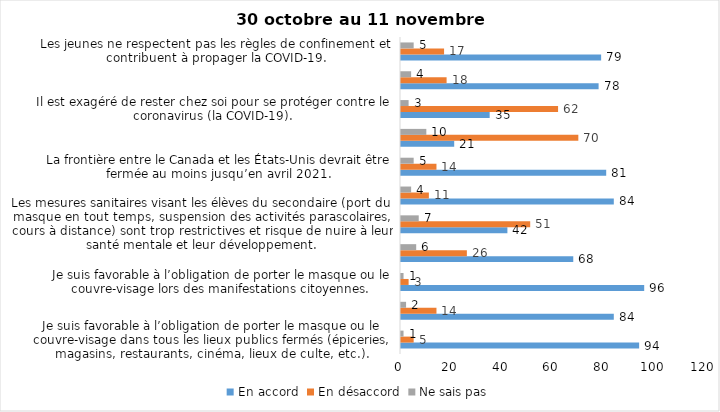
| Category | En accord | En désaccord | Ne sais pas |
|---|---|---|---|
| Je suis favorable à l’obligation de porter le masque ou le couvre-visage dans tous les lieux publics fermés (épiceries, magasins, restaurants, cinéma, lieux de culte, etc.). | 94 | 5 | 1 |
| C’est une bonne chose que les policiers puissent donner facilement des contraventions aux gens qui ne respectent pas les mesures pour prévenir le coronavirus (la COVID-19). | 84 | 14 | 2 |
| Je suis favorable à l’obligation de porter le masque ou le couvre-visage lors des manifestations citoyennes. | 96 | 3 | 1 |
| C’est une bonne chose d’arrêter les activités sportives de groupe (ex. hockey, soccer, yoga, etc.) et de fermer les centres d’entraînement (gyms) dans les zones rouges. | 68 | 26 | 6 |
| Les mesures sanitaires visant les élèves du secondaire (port du masque en tout temps, suspension des activités parascolaires, cours à distance) sont trop restrictives et risque de nuire à leur santé mentale et leur développement. | 42 | 51 | 7 |
| Je suis favorable à l’obligation de porter le masque ou le couvre-visage en tout temps pour les élèves au secondaire. | 84 | 11 | 4 |
| La frontière entre le Canada et les États-Unis devrait être fermée au moins jusqu’en avril 2021. | 81 | 14 | 5 |
| Le gouvernement et les médias exagèrent par rapport au coronavirus (la COVID-19). | 21 | 70 | 10 |
| Il est exagéré de rester chez soi pour se protéger contre le coronavirus (la COVID-19). | 35 | 62 | 3 |
| J’ai peur que le système de santé soit débordé par les cas de COVID-19 suite au «déconfinement». | 78 | 18 | 4 |
| Les jeunes ne respectent pas les règles de confinement et contribuent à propager la COVID-19. | 79 | 17 | 5 |